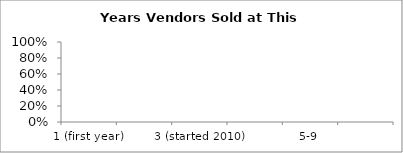
| Category | Series 0 |
|---|---|
| 1 (first year) | 0 |
| 2 (started last year | 0 |
| 3 (started 2010) | 0 |
| 4-6 | 0 |
| 5-9 | 0 |
| 10 or more | 0 |